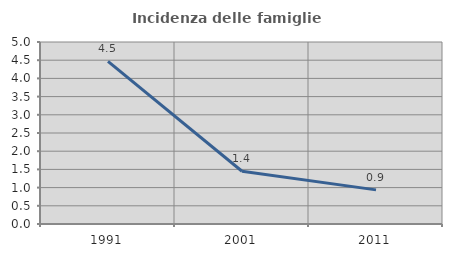
| Category | Incidenza delle famiglie numerose |
|---|---|
| 1991.0 | 4.469 |
| 2001.0 | 1.449 |
| 2011.0 | 0.938 |